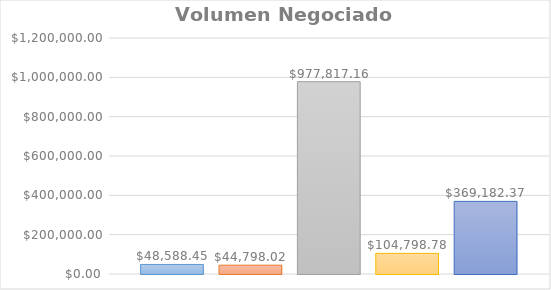
| Category | Lunes | Martes | Miercoles | Jueves | Viernes |
|---|---|---|---|---|---|
| 0 | 48588.45 | 44798.02 | 977817.16 | 104798.78 | 369182.37 |